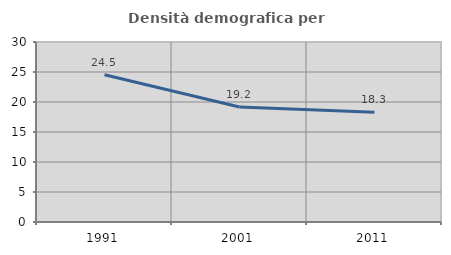
| Category | Densità demografica |
|---|---|
| 1991.0 | 24.542 |
| 2001.0 | 19.171 |
| 2011.0 | 18.291 |